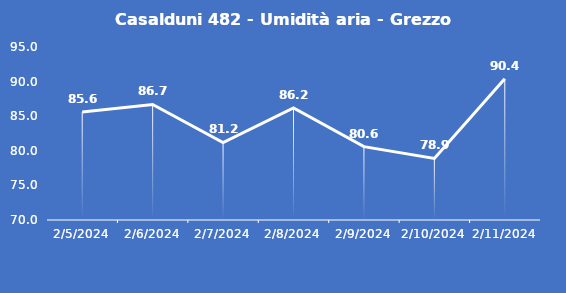
| Category | Casalduni 482 - Umidità aria - Grezzo (%) |
|---|---|
| 2/5/24 | 85.6 |
| 2/6/24 | 86.7 |
| 2/7/24 | 81.2 |
| 2/8/24 | 86.2 |
| 2/9/24 | 80.6 |
| 2/10/24 | 78.9 |
| 2/11/24 | 90.4 |